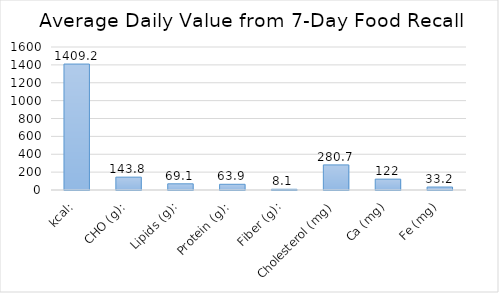
| Category | Series 0 |
|---|---|
| kcal: | 1409.2 |
| CHO (g): | 143.8 |
| Lipids (g): | 69.1 |
| Protein (g): | 63.9 |
| Fiber (g): | 8.1 |
| Cholesterol (mg) | 280.7 |
| Ca (mg) | 121.5 |
| Fe (mg) | 33.2 |